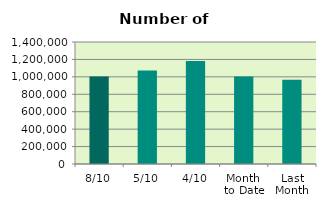
| Category | Series 0 |
|---|---|
| 8/10 | 1002960 |
| 5/10 | 1074322 |
| 4/10 | 1181378 |
| Month 
to Date | 1004557 |
| Last
Month | 967047.5 |